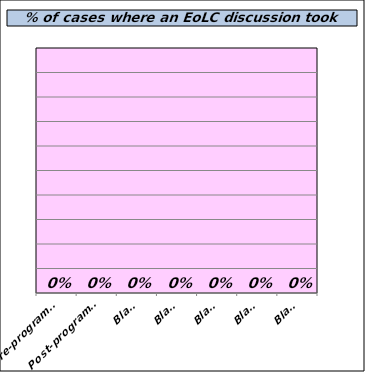
| Category | Yes |
|---|---|
| Pre-programme | 0 |
| Post-programme | 0 |
| Blank | 0 |
| Blank | 0 |
| Blank | 0 |
| Blank | 0 |
| Blank | 0 |